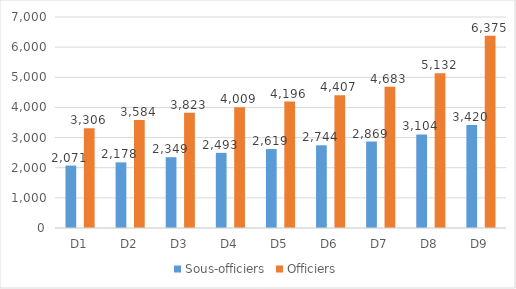
| Category | Sous-officiers | Officiers |
|---|---|---|
| D1 | 2071 | 3306.083 |
| D2 | 2177.708 | 3584.417 |
| D3 | 2349.083 | 3822.667 |
| D4 | 2492.5 | 4008.667 |
| D5 | 2619.333 | 4195.708 |
| D6 | 2743.833 | 4407.417 |
| D7 | 2868.75 | 4683.167 |
| D8 | 3104.083 | 5132.25 |
| D9 | 3419.583 | 6375.083 |